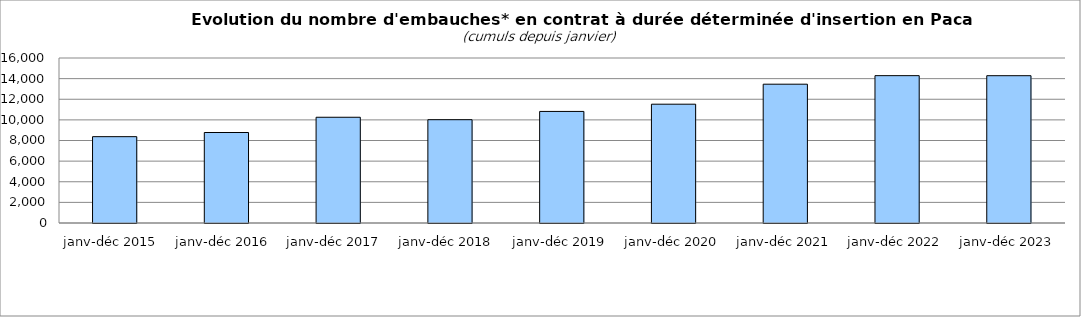
| Category | Series 0 |
|---|---|
| janv-déc 2015  | 8372 |
| janv-déc 2016  | 8775 |
| janv-déc 2017  | 10254 |
| janv-déc 2018  | 10017 |
| janv-déc 2019 | 10819 |
| janv-déc 2020 | 11521 |
| janv-déc 2021 | 13460 |
| janv-déc 2022 | 14289 |
| janv-déc 2023 | 14284 |